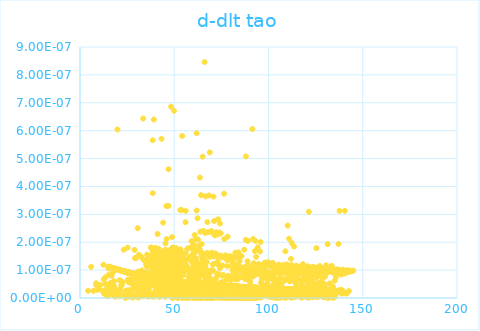
| Category | dlt tao |
|---|---|
| 4.34223444783905 | 0 |
| 5.92072630679717 | 0 |
| 7.15925973826904 | 0 |
| 8.57058924462024 | 0 |
| 8.62293453529598 | 0 |
| 9.17360343594597 | 0 |
| 10.0824104260836 | 0 |
| 10.8974767721707 | 0 |
| 12.1183744784521 | 0 |
| 12.4721690174564 | 0 |
| 12.5600557323604 | 0 |
| 12.8083956840816 | 0 |
| 13.4668110553315 | 0 |
| 13.4927758448734 | 0 |
| 14.1511483632955 | 0 |
| 14.3650617819764 | 0 |
| 15.078295659656 | 0 |
| 15.0849262510627 | 0 |
| 15.0882404540755 | 0 |
| 15.2136451910777 | 0 |
| 15.2661390010703 | 0 |
| 15.2661390010703 | 0 |
| 15.3053912070224 | 0 |
| 15.6222597597147 | 0 |
| 15.8320876702979 | 0 |
| 15.8825375806261 | 0 |
| 16.1355198242883 | 0 |
| 16.2158872714385 | 0 |
| 16.2282161681437 | 0 |
| 16.2466919709829 | 0 |
| 16.5817670952164 | 0 |
| 16.7198983250497 | 0 |
| 16.9780740957271 | 0 |
| 17.0661946549311 | 0 |
| 17.4829917348262 | 0 |
| 17.5685799084616 | 0 |
| 17.7018360629625 | 0 |
| 18.0043050407396 | 0 |
| 18.0209600188225 | 0 |
| 18.0625302767912 | 0 |
| 18.0818970243722 | 0 |
| 18.2141428565826 | 0 |
| 18.3127005108477 | 0 |
| 18.3454353995756 | 0 |
| 18.3753911522993 | 0 |
| 18.5379340812292 | 0 |
| 18.6267281077488 | 0 |
| 18.6776604530653 | 0 |
| 18.9487466603995 | 0 |
| 19.2003906210264 | 0 |
| 19.2861349160479 | 0 |
| 19.8508186229183 | 0 |
| 19.860891218674 | 0 |
| 19.8986180424672 | 0 |
| 19.9963746714248 | 0 |
| 20.0163683019673 | 0 |
| 20.1085802581883 | 0 |
| 20.1532875729991 | 0 |
| 20.197895930022 | 0 |
| 20.4537282665044 | 0 |
| 20.578022256767 | 0 |
| 20.824384744813 | 0 |
| 20.8531772159544 | 0 |
| 20.8843242648643 | 0 |
| 21.0060705511526 | 0 |
| 21.032237161082 | 0 |
| 21.0464961454395 | 0 |
| 21.0773575193856 | 0 |
| 21.1767561255259 | 0 |
| 21.2192129920033 | 0 |
| 21.2756903530767 | 0 |
| 21.4232350498238 | 0 |
| 21.5326496279487 | 0 |
| 21.5697705133828 | 0 |
| 21.8713282632766 | 0 |
| 21.912439389534 | 0 |
| 21.9352456106605 | 0 |
| 21.9398040100635 | 0 |
| 22.1665288216265 | 0 |
| 22.1980855030338 | 0 |
| 22.4623017520467 | 0 |
| 22.5422935833956 | 0 |
| 22.7388434182568 | 0 |
| 22.7739983314305 | 0 |
| 22.8266291861063 | 0 |
| 22.8791389698127 | 0 |
| 23.2412349069493 | 0 |
| 23.243386156066 | 0 |
| 23.260588986524 | 0 |
| 23.4297887314419 | 0 |
| 23.5064884659534 | 0 |
| 23.6443439325349 | 0 |
| 23.7477367342659 | 0 |
| 23.8108168696498 | 0 |
| 23.836002181574 | 0 |
| 24.0344544352477 | 0 |
| 24.0739485751715 | 0 |
| 24.0843310058635 | 0 |
| 24.0926337290052 | 0 |
| 24.1486024440339 | 0 |
| 24.1734358335757 | 0 |
| 24.204441741135 | 0 |
| 24.220961995759 | 0 |
| 24.2477834038495 | 0 |
| 24.3773460409455 | 0 |
| 24.4612959591269 | 0 |
| 24.6871424024734 | 0 |
| 24.7073875591897 | 0 |
| 24.9350155404002 | 0 |
| 25.045059393022 | 0 |
| 25.1407040474208 | 0 |
| 25.1744910574176 | 0 |
| 25.257771081392 | 0 |
| 25.3131388808263 | 0 |
| 25.3664148038307 | 0 |
| 25.4608523030947 | 0 |
| 25.6077136816234 | 0 |
| 25.6779087933578 | 0 |
| 25.7012645603286 | 0 |
| 25.7420861625471 | 0 |
| 25.8815571401722 | 0 |
| 25.9779714373544 | 0 |
| 26.1754656119046 | 0 |
| 26.1792857045413 | 0 |
| 26.2212699921266 | 0 |
| 26.3392292977604 | 0 |
| 26.3961171387005 | 0 |
| 26.4150525269211 | 0 |
| 26.5453385738438 | 0 |
| 26.6186964369032 | 0 |
| 26.6449807656151 | 0 |
| 26.7255495733951 | 0 |
| 26.815200912915 | 0 |
| 26.8412928153619 | 0 |
| 27.0250809434495 | 0 |
| 27.0306307732543 | 0 |
| 27.093449392796 | 0 |
| 27.1266474154106 | 0 |
| 27.2259986042753 | 0 |
| 27.2792045338569 | 0 |
| 27.3414520462978 | 0 |
| 27.4053826829694 | 0 |
| 27.5327986227336 | 0 |
| 27.5926620680209 | 0 |
| 27.6252601797703 | 0 |
| 27.6578198706984 | 0 |
| 27.7120010103926 | 0 |
| 27.7210209047214 | 0 |
| 27.7336438283901 | 0 |
| 27.8074630270365 | 0 |
| 28.1025799527374 | 0 |
| 28.1203662849544 | 0 |
| 28.2374750995906 | 0 |
| 28.2374750995906 | 0 |
| 28.290546124103 | 0 |
| 28.3205755591231 | 0 |
| 28.3276366822225 | 0 |
| 28.3752533028342 | 0 |
| 28.4227901515668 | 0 |
| 28.4333431027729 | 0 |
| 28.4368598829055 | 0 |
| 28.6016607909401 | 0 |
| 28.76725569115 | 0 |
| 28.8349614183893 | 0 |
| 28.8626921821233 | 0 |
| 28.9336309508503 | 0 |
| 29.0061200438804 | 0 |
| 29.0938997042335 | 0 |
| 29.1419800288175 | 0 |
| 29.2036812747982 | 0 |
| 29.3829031921626 | 0 |
| 29.4271133480673 | 0 |
| 29.4848266062394 | 0 |
| 29.6572925264597 | 0 |
| 29.7027776478901 | 0 |
| 29.9341777906125 | 0 |
| 29.9475374613673 | 0 |
| 30.0175781834578 | 0 |
| 30.0741583423377 | 0 |
| 30.1090517950998 | 0 |
| 30.2085252867465 | 0 |
| 30.3505354153761 | 0 |
| 30.3604183106887 | 0 |
| 30.416360729055 | 0 |
| 30.4196482556916 | 0 |
| 30.4311518020597 | 0 |
| 30.4410085246859 | 0 |
| 30.5590412153261 | 0 |
| 30.5590412153261 | 0 |
| 30.6064535678343 | 0 |
| 30.62278563423 | 0 |
| 30.798620098959 | 0 |
| 30.8213400098049 | 0 |
| 30.8715888803929 | 0 |
| 30.9912084307792 | 0 |
| 31.1039386573469 | 0 |
| 31.1745890109236 | 0 |
| 31.2514799649553 | 0 |
| 31.2626774285249 | 0 |
| 31.3712447951942 | 0 |
| 31.3871789111414 | 0 |
| 31.40628917908 | 0 |
| 31.5397368410074 | 0 |
| 31.5951736820673 | 0 |
| 31.6378728741362 | 0 |
| 31.7483070414786 | 0 |
| 31.7892277351936 | 0 |
| 31.8238118395644 | 0 |
| 31.8928675411917 | 0 |
| 31.8991379193859 | 0 |
| 31.9257732874241 | 0 |
| 31.9789774695815 | 0 |
| 32.0211648757506 | 0 |
| 32.2498837207206 | 0 |
| 32.3798548483467 | 0 |
| 32.3844870269702 | 0 |
| 32.3844870269702 | 0 |
| 32.5231456043231 | 0 |
| 32.5584858370287 | 0 |
| 32.564628049465 | 0 |
| 32.647434815005 | 0 |
| 32.6596846279936 | 0 |
| 32.6734601779487 | 0 |
| 32.7208649029942 | 0 |
| 33.0068932194474 | 0 |
| 33.0114374119032 | 0 |
| 33.0311216884925 | 0 |
| 33.0432292610755 | 0 |
| 33.0674311067552 | 0 |
| 33.0946370277723 | 0 |
| 33.0946370277723 | 0 |
| 33.2167879241808 | 0 |
| 33.275441394518 | 0 |
| 33.3054800295687 | 0 |
| 33.3069812501824 | 0 |
| 33.3234902133615 | 0 |
| 33.4373294388173 | 0 |
| 33.4866391266726 | 0 |
| 33.5045519295513 | 0 |
| 33.5045519295513 | 0 |
| 33.522455160683 | 0 |
| 33.5343853380377 | 0 |
| 33.6029016604221 | 0 |
| 33.6148032866474 | 0 |
| 33.6742483212321 | 0 |
| 33.8991887808543 | 0 |
| 33.9448817938729 | 0 |
| 33.9831575931372 | 0 |
| 34.0243295304992 | 0 |
| 34.0903945415714 | 0 |
| 34.1387609616987 | 0 |
| 34.1899839134212 | 0 |
| 34.2046049531346 | 0 |
| 34.4188175276258 | 0 |
| 34.4522132815876 | 0 |
| 34.4884763363069 | 0 |
| 34.504420006718 | 0 |
| 34.5869194927794 | 0 |
| 34.657683130873 | 0 |
| 34.6605683738741 | 0 |
| 34.7254229635868 | 0 |
| 34.8246320870731 | 0 |
| 34.8389867820521 | 0 |
| 34.8519009524588 | 0 |
| 34.9722032477223 | 0 |
| 34.9936422797056 | 0 |
| 35.0136401992138 | 0 |
| 35.0578807117601 | 0 |
| 35.1390808075567 | 0 |
| 35.177478590712 | 0 |
| 35.1817424241609 | 0 |
| 35.443687731386 | 0 |
| 35.4986619466143 | 0 |
| 35.52963551741 | 0 |
| 35.5718287412947 | 0 |
| 35.7848431601984 | 0 |
| 35.8323178150675 | 0 |
| 35.9187277057526 | 0 |
| 35.9896512903362 | 0 |
| 36.0063188898838 | 0 |
| 36.0285303613678 | 0 |
| 36.0576621538335 | 0 |
| 36.0659812011264 | 0 |
| 36.0729122750022 | 0 |
| 36.0826135417045 | 0 |
| 36.1283129968727 | 0 |
| 36.1324646267038 | 0 |
| 36.2926301058493 | 0 |
| 36.4424889380514 | 0 |
| 36.4589495186024 | 0 |
| 36.4589495186024 | 0 |
| 36.5534540091631 | 0 |
| 36.5575573582262 | 0 |
| 36.6545358721127 | 0 |
| 36.7008855478993 | 0 |
| 36.7974863271936 | 0 |
| 36.8029210797187 | 0 |
| 36.8219363966644 | 0 |
| 36.876211844494 | 0 |
| 36.8870573507836 | 0 |
| 37.0507084952501 | 0 |
| 37.0749915711386 | 0 |
| 37.0749915711386 | 0 |
| 37.1396688192019 | 0 |
| 37.1719652426395 | 0 |
| 37.1786901329243 | 0 |
| 37.190791871107 | 0 |
| 37.1948249088499 | 0 |
| 37.2163270621914 | 0 |
| 37.3316889518811 | 0 |
| 37.4333407539322 | 0 |
| 37.460045381713 | 0 |
| 37.5160632263035 | 0 |
| 37.5440408054328 | 0 |
| 37.5733283061269 | 0 |
| 37.5839726479253 | 0 |
| 37.6132290557458 | 0 |
| 37.7088185972459 | 0 |
| 37.8755197984133 | 0 |
| 37.8873989606043 | 0 |
| 37.8873989606043 | 0 |
| 38.0638279735499 | 0 |
| 38.1005905466044 | 0 |
| 38.1478046550519 | 0 |
| 38.1674599626436 | 0 |
| 38.1871051534415 | 0 |
| 38.2485947454282 | 0 |
| 38.3478161047015 | 0 |
| 38.4532833448589 | 0 |
| 38.494869788064 | 0 |
| 38.5221364931905 | 0 |
| 38.5312211070451 | 0 |
| 38.564945222313 | 0 |
| 38.6077064845867 | 0 |
| 38.8992930527021 | 0 |
| 38.901863708568 | 0 |
| 38.9378350707894 | 0 |
| 38.9763389763585 | 0 |
| 39.0019871288631 | 0 |
| 39.0481113499744 | 0 |
| 39.0493918006414 | 0 |
| 39.0609139678016 | 0 |
| 39.0647539349732 | 0 |
| 39.0685935247227 | 0 |
| 39.0724327371614 | 0 |
| 39.1146392032446 | 0 |
| 39.164460930798 | 0 |
| 39.1721201877049 | 0 |
| 39.1989158013331 | 0 |
| 39.2167693722979 | 0 |
| 39.2524521527 | 0 |
| 39.266461516159 | 0 |
| 39.373277740112 | 0 |
| 39.4050123715245 | 0 |
| 39.4202359201464 | 0 |
| 39.4202359201464 | 0 |
| 39.4240408887775 | 0 |
| 39.4278454902116 | 0 |
| 39.5190460411179 | 0 |
| 39.519046041118 | 0 |
| 39.6504098339475 | 0 |
| 39.678142597657 | 0 |
| 39.6844427956347 | 0 |
| 39.7561944858911 | 0 |
| 39.8541716762499 | 0 |
| 39.9155984547395 | 0 |
| 39.9494055024602 | 0 |
| 39.9681748394895 | 0 |
| 39.9906864157143 | 0 |
| 39.9906864157144 | 0 |
| 40.0693773348177 | 0 |
| 40.0880905007959 | 0 |
| 40.1690801487911 | 0 |
| 40.1852584911432 | 0 |
| 40.1852584911432 | 0 |
| 40.2287832279327 | 0 |
| 40.230026099917 | 0 |
| 40.2933617361471 | 0 |
| 40.2970842617676 | 0 |
| 40.32561220862 | 0 |
| 40.3677470265558 | 0 |
| 40.4086005696807 | 0 |
| 40.4630077972461 | 0 |
| 40.5074684471889 | 0 |
| 40.6885118921791 | 0 |
| 40.7302712978934 | 0 |
| 40.7376361611716 | 0 |
| 40.7449996932139 | 0 |
| 40.7449996932139 | 0 |
| 40.8406047947383 | 0 |
| 40.8699767555598 | 0 |
| 40.8699767555598 | 0 |
| 40.965290185717 | 0 |
| 41.0372391858907 | 0 |
| 41.0421125187289 | 0 |
| 41.0810783694878 | 0 |
| 41.1078459664332 | 0 |
| 41.1175753176181 | 0 |
| 41.1175753176181 | 0 |
| 41.2050360999721 | 0 |
| 41.3757779383059 | 0 |
| 41.3939005168636 | 0 |
| 41.413222526145 | 0 |
| 41.4699288641782 | 0 |
| 41.5036745361179 | 0 |
| 41.6083525268665 | 0 |
| 41.6119574161082 | 0 |
| 41.6323792257901 | 0 |
| 41.6899868073858 | 0 |
| 41.7235544986282 | 0 |
| 41.7307440623816 | 0 |
| 41.8264868235428 | 0 |
| 41.8527776855969 | 0 |
| 41.8527776855969 | 0 |
| 41.9982737740493 | 0 |
| 42.063701691601 | 0 |
| 42.0637016916011 | 0 |
| 42.0850923724779 | 0 |
| 42.1302148107507 | 0 |
| 42.1563162527278 | 0 |
| 42.1634320234964 | 0 |
| 42.1764744851914 | 0 |
| 42.1847721340296 | 0 |
| 42.2096552935463 | 0 |
| 42.2380752402379 | 0 |
| 42.2439936559033 | 0 |
| 42.2475443073322 | 0 |
| 42.2617439299421 | 0 |
| 42.3728096779055 | 0 |
| 42.3869673366708 | 0 |
| 42.3869673366708 | 0 |
| 42.4294119685861 | 0 |
| 42.4859388504008 | 0 |
| 42.4859388504009 | 0 |
| 42.565890099938 | 0 |
| 42.6151968199139 | 0 |
| 42.693734903379 | 0 |
| 42.6995901619676 | 0 |
| 42.7919969153112 | 0 |
| 42.797838730478 | 0 |
| 42.890033807401 | 0 |
| 42.8970278690727 | 0 |
| 42.918003215434 | 0 |
| 42.918003215434 | 0 |
| 42.980867836748 | 0 |
| 43.0157529284331 | 0 |
| 43.02272655237 | 0 |
| 43.139946685178 | 0 |
| 43.1411056881949 | 0 |
| 43.1434236008224 | 0 |
| 43.1608039776833 | 0 |
| 43.2001736107623 | 0 |
| 43.2001736107623 | 0 |
| 43.2371946361001 | 0 |
| 43.2753393978603 | 0 |
| 43.2868917803069 | 0 |
| 43.3584478504478 | 0 |
| 43.3619072458765 | 0 |
| 43.4080061739767 | 0 |
| 43.4114616201759 | 0 |
| 43.427583400415 | 0 |
| 43.475912871382 | 0 |
| 43.6217262381947 | 0 |
| 43.6217262381947 | 0 |
| 43.7179025114426 | 0 |
| 43.7453426092424 | 0 |
| 43.7647689357547 | 0 |
| 43.8195732521438 | 0 |
| 43.8412477012231 | 0 |
| 43.8446690031981 | 0 |
| 43.8914000688062 | 0 |
| 43.9358054438518 | 0 |
| 44.0051701507902 | 0 |
| 44.1197801445111 | 0 |
| 44.2114804095045 | 0 |
| 44.2295715556911 | 0 |
| 44.3176601367897 | 0 |
| 44.3176601367897 | 0 |
| 44.3379634173696 | 0 |
| 44.4798268881524 | 0 |
| 44.5371193500433 | 0 |
| 44.6044280313065 | 0 |
| 44.6649191200432 | 0 |
| 44.6649191200432 | 0 |
| 44.7610880117988 | 0 |
| 44.7990513292413 | 0 |
| 44.848132625562 | 0 |
| 44.9183147502219 | 0 |
| 44.9327831321408 | 0 |
| 44.9327831321408 | 0 |
| 44.976160351902 | 0 |
| 44.9950552838865 | 0 |
| 45.0117206958365 | 0 |
| 45.0161637636972 | 0 |
| 45.0561316581883 | 0 |
| 45.0627895275026 | 0 |
| 45.1492524855063 | 0 |
| 45.1558966249149 | 0 |
| 45.1592183280446 | 0 |
| 45.2012721059928 | 0 |
| 45.2244955748541 | 0 |
| 45.2256011568669 | 0 |
| 45.2775330600067 | 0 |
| 45.2819500463485 | 0 |
| 45.3404344928453 | 0 |
| 45.3415372478702 | 0 |
| 45.3448453520353 | 0 |
| 45.3503583227299 | 0 |
| 45.3580753559937 | 0 |
| 45.4571776510597 | 0 |
| 45.5022526914877 | 0 |
| 45.6010416547692 | 0 |
| 45.6185817403391 | 0 |
| 45.650355967944 | 0 |
| 45.7236809541839 | 0 |
| 45.7269614122784 | 0 |
| 45.7269614122784 | 0 |
| 45.7488251215264 | 0 |
| 45.7630309310911 | 0 |
| 45.8121708719419 | 0 |
| 45.8176276120883 | 0 |
| 45.8350848150192 | 0 |
| 45.8547162241792 | 0 |
| 45.9527474695475 | 0 |
| 46.0625118724544 | 0 |
| 46.075535808062 | 0 |
| 46.1254268272934 | 0 |
| 46.1536022429452 | 0 |
| 46.2672130131046 | 0 |
| 46.3007019385236 | 0 |
| 46.3125792846825 | 0 |
| 46.3427987933401 | 0 |
| 46.3643720975492 | 0 |
| 46.39671324566 | 0 |
| 46.4484122441231 | 0 |
| 46.4548705734931 | 0 |
| 46.514030141453 | 0 |
| 46.5451930923055 | 0 |
| 46.6331963305112 | 0 |
| 46.636412812308 | 0 |
| 46.6717794818239 | 0 |
| 46.7937495826099 | 0 |
| 46.808706455103 | 0 |
| 46.8930165376466 | 0 |
| 46.8930165376466 | 0 |
| 46.9335168083535 | 0 |
| 46.9441689669761 | 0 |
| 46.9824967408077 | 0 |
| 47.067557829146 | 0 |
| 47.1927430861992 | 0 |
| 47.3672355114799 | 0 |
| 47.3672355114799 | 0 |
| 47.3735685799582 | 0 |
| 47.3735685799582 | 0 |
| 47.3830665955677 | 0 |
| 47.3851770071612 | 0 |
| 47.3946726964118 | 0 |
| 47.436852762383 | 0 |
| 47.4494994704897 | 0 |
| 47.483207558041 | 0 |
| 47.5000526315498 | 0 |
| 47.5053154920584 | 0 |
| 47.5158394643302 | 0 |
| 47.6440447485307 | 0 |
| 47.7321170701656 | 0 |
| 47.7928341909119 | 0 |
| 47.9234285084029 | 0 |
| 47.9922389558979 | 0 |
| 48.0016145561792 | 0 |
| 48.0245249846368 | 0 |
| 48.0422210144369 | 0 |
| 48.0495057206627 | 0 |
| 48.0827931800972 | 0 |
| 48.143068036842 | 0 |
| 48.1492990603186 | 0 |
| 48.1773286930689 | 0 |
| 48.2074164418713 | 0 |
| 48.214676188895 | 0 |
| 48.2395584556907 | 0 |
| 48.2488859975026 | 0 |
| 48.2758221058948 | 0 |
| 48.3079186055454 | 0 |
| 48.3079186055454 | 0 |
| 48.3203373332596 | 0 |
| 48.3327528700777 | 0 |
| 48.3947827766589 | 0 |
| 48.4040804065112 | 0 |
| 48.4185398375457 | 0 |
| 48.4319625867051 | 0 |
| 48.4412530804066 | 0 |
| 48.5340602051796 | 0 |
| 48.6071496798568 | 0 |
| 48.6729390935045 | 0 |
| 48.7058004759187 | 0 |
| 48.7222228556949 | 0 |
| 48.7683811500853 | 0 |
| 48.7806826520499 | 0 |
| 48.7991290905893 | 0 |
| 48.7991290905893 | 0 |
| 48.8226893974513 | 0 |
| 48.8421436875983 | 0 |
| 48.86261351995 | 0 |
| 48.8759143136985 | 0 |
| 48.8973925685205 | 0 |
| 48.8973925685205 | 0 |
| 48.9147728196708 | 0 |
| 48.9484933373848 | 0 |
| 48.9944384598905 | 0 |
| 49.0923110069184 | 0 |
| 49.1360865352543 | 0 |
| 49.1360865352543 | 0 |
| 49.147278663218 | 0 |
| 49.1808397650955 | 0 |
| 49.186939323361 | 0 |
| 49.2153939331994 | 0 |
| 49.2661648598711 | 0 |
| 49.2722538554916 | 0 |
| 49.2844295898817 | 0 |
| 49.4191764399206 | 0 |
| 49.4242349460262 | 0 |
| 49.5182289667149 | 0 |
| 49.5222677186738 | 0 |
| 49.5404380279384 | 0 |
| 49.5848263080552 | 0 |
| 49.5949090129219 | 0 |
| 49.6855612829321 | 0 |
| 49.6966296643948 | 0 |
| 49.8142048014419 | 0 |
| 49.8302618897393 | 0 |
| 49.8633633041334 | 0 |
| 49.8633633041334 | 0 |
| 49.8804069750839 | 0 |
| 49.9405146148896 | 0 |
| 49.9475224610791 | 0 |
| 49.9925494448923 | 0 |
| 50.0125484253702 | 0 |
| 50.0695016951437 | 0 |
| 50.1154167896467 | 0 |
| 50.2290254733257 | 0 |
| 50.3542947522851 | 0 |
| 50.466374944115 | 0 |
| 50.4941085672378 | 0 |
| 50.5495301659669 | 0 |
| 50.5673313513775 | 0 |
| 50.5940213859306 | 0 |
| 50.6305737672407 | 0 |
| 50.8434361545323 | 0 |
| 50.8601513957637 | 0 |
| 50.9348112787316 | 0 |
| 50.9877926566742 | 0 |
| 50.9897538727145 | 0 |
| 51.020143080944 | 0 |
| 51.0230830115155 | 0 |
| 51.0436577842929 | 0 |
| 51.0612867052917 | 0 |
| 51.0965263007183 | 0 |
| 51.0965263007183 | 0 |
| 51.1112022946047 | 0 |
| 51.1376084696968 | 0 |
| 51.143474657086 | 0 |
| 51.1923334103848 | 0 |
| 51.2020995663264 | 0 |
| 51.2050290498892 | 0 |
| 51.2957600587027 | 0 |
| 51.2986841936516 | 0 |
| 51.301608161928 | 0 |
| 51.3094045960387 | 0 |
| 51.3103790670075 | 0 |
| 51.3308386839724 | 0 |
| 51.409678077187 | 0 |
| 51.4611989755388 | 0 |
| 51.5000485436665 | 0 |
| 51.546629375741 | 0 |
| 51.5689344470099 | 0 |
| 51.627076229436 | 0 |
| 51.6280447044046 | 0 |
| 51.6541866647806 | 0 |
| 51.6677365480626 | 0 |
| 51.6832177790818 | 0 |
| 51.6909566558794 | 0 |
| 51.696760053218 | 0 |
| 51.7325332841917 | 0 |
| 51.7373656074601 | 0 |
| 51.747028900218 | 0 |
| 51.7499275361812 | 0 |
| 51.7499275361812 | 0 |
| 51.8126914954242 | 0 |
| 51.8483847385818 | 0 |
| 51.8512777084615 | 0 |
| 51.8647761009339 | 0 |
| 51.9081400167642 | 0 |
| 51.9341409864455 | 0 |
| 51.9370291795748 | 0 |
| 52.0322496150224 | 0 |
| 52.1157845570802 | 0 |
| 52.1934382849032 | 0 |
| 52.2135518807139 | 0 |
| 52.2145094777304 | 0 |
| 52.2346149598138 | 0 |
| 52.3292938993065 | 0 |
| 52.3350265118878 | 0 |
| 52.3579506856409 | 0 |
| 52.4028148098936 | 0 |
| 52.4123554135854 | 0 |
| 52.4180789422886 | 0 |
| 52.420940472296 | 0 |
| 52.4457338589136 | 0 |
| 52.4552666564569 | 0 |
| 52.4752798944417 | 0 |
| 52.4981428242943 | 0 |
| 52.5029046815507 | 0 |
| 52.5971006805508 | 0 |
| 52.6939749876587 | 0 |
| 52.779304656276 | 0 |
| 52.8275969546221 | 0 |
| 52.8285434211469 | 0 |
| 52.8332754994426 | 0 |
| 52.8701711743021 | 0 |
| 52.8739538903608 | 0 |
| 52.9240493537673 | 0 |
| 52.9863661709312 | 0 |
| 53.0071221629697 | 0 |
| 53.0071221629697 | 0 |
| 53.0184401882968 | 0 |
| 53.0806461904902 | 0 |
| 53.0806461904902 | 0 |
| 53.1004237271229 | 0 |
| 53.1004237271229 | 0 |
| 53.1963814558848 | 0 |
| 53.2245713932954 | 0 |
| 53.3390569845399 | 0 |
| 53.3456183767702 | 0 |
| 53.3784132398107 | 0 |
| 53.4205484808983 | 0 |
| 53.4242922274128 | 0 |
| 53.4242922274128 | 0 |
| 53.600886186704 | 0 |
| 53.600886186704 | 0 |
| 53.6064828169131 | 0 |
| 53.6903622636317 | 0 |
| 53.6978118734833 | 0 |
| 53.7592317653443 | 0 |
| 53.8131489507908 | 0 |
| 53.8205815650481 | 0 |
| 53.8242974872873 | 0 |
| 53.8317285622522 | 0 |
| 53.8317285622522 | 0 |
| 54.0162475557123 | 0 |
| 54.0162475557124 | 0 |
| 54.021801154719 | 0 |
| 54.021801154719 | 0 |
| 54.0319812703551 | 0 |
| 54.0467852883037 | 0 |
| 54.0606603733251 | 0 |
| 54.0994916796822 | 0 |
| 54.1096571787329 | 0 |
| 54.1161251384465 | 0 |
| 54.1327534862213 | 0 |
| 54.1382951338514 | 0 |
| 54.1438362142913 | 0 |
| 54.149376727715 | 0 |
| 54.184453489908 | 0 |
| 54.189989850525 | 0 |
| 54.1964482231078 | 0 |
| 54.2148964768909 | 0 |
| 54.2794159880152 | 0 |
| 54.2877057905379 | 0 |
| 54.2904687767568 | 0 |
| 54.3971966189435 | 0 |
| 54.455991405905 | 0 |
| 54.490870795024 | 0 |
| 54.6310808972329 | 0 |
| 54.6338265180099 | 0 |
| 54.6484674990983 | 0 |
| 54.6594456612945 | 0 |
| 54.6896242444579 | 0 |
| 54.706078272894 | 0 |
| 54.7161310766761 | 0 |
| 54.718872429903 | 0 |
| 54.7444517736729 | 0 |
| 54.8046987036696 | 0 |
| 54.9350070537904 | 0 |
| 54.9786776850808 | 0 |
| 55.0068632081489 | 0 |
| 55.0858874849085 | 0 |
| 55.0913332566929 | 0 |
| 55.0940559407274 | 0 |
| 55.1366937710269 | 0 |
| 55.1502946501649 | 0 |
| 55.1566405793536 | 0 |
| 55.2490271407561 | 0 |
| 55.2490271407561 | 0 |
| 55.2598859933677 | 0 |
| 55.289736841479 | 0 |
| 55.3249943515587 | 0 |
| 55.3249943515587 | 0 |
| 55.3575198143848 | 0 |
| 55.3728724196244 | 0 |
| 55.379192843522 | 0 |
| 55.3837069904137 | 0 |
| 55.5189607251433 | 0 |
| 55.5540727579896 | 0 |
| 55.571170583316 | 0 |
| 55.5900620614872 | 0 |
| 55.6107453645426 | 0 |
| 55.6404079783749 | 0 |
| 55.735581095024 | 0 |
| 55.735581095024 | 0 |
| 55.7911731369757 | 0 |
| 55.8672981269007 | 0 |
| 55.8690880541288 | 0 |
| 55.9388505423556 | 0 |
| 55.9388505423556 | 0 |
| 55.9683392642662 | 0 |
| 55.9710192867702 | 0 |
| 55.979951768468 | 0 |
| 55.9853105733995 | 0 |
| 56.0460078863785 | 0 |
| 56.0460078863785 | 0 |
| 56.0888135014461 | 0 |
| 56.1084218277435 | 0 |
| 56.1511798629379 | 0 |
| 56.3005772616942 | 0 |
| 56.3005772616942 | 0 |
| 56.3556119654467 | 0 |
| 56.3910897216928 | 0 |
| 56.3928630236132 | 0 |
| 56.4123656656943 | 0 |
| 56.472603977504 | 0 |
| 56.5372001429148 | 0 |
| 56.6220363462848 | 0 |
| 56.6264514162772 | 0 |
| 56.7772401583592 | 0 |
| 56.8230147035513 | 0 |
| 56.859959549757 | 0 |
| 56.986445756864 | 0 |
| 57.0460778669314 | 0 |
| 57.0600998947601 | 0 |
| 57.0811264780225 | 0 |
| 57.1284079946221 | 0 |
| 57.1336590811406 | 0 |
| 57.1572830005066 | 0 |
| 57.1887663794211 | 0 |
| 57.2114936004996 | 0 |
| 57.2464409374067 | 0 |
| 57.2464409374067 | 0 |
| 57.2778753097564 | 0 |
| 57.2979493524856 | 0 |
| 57.3110373313902 | 0 |
| 57.3197609904298 | 0 |
| 57.3197609904298 | 0 |
| 57.3616160860205 | 0 |
| 57.5600121612218 | 0 |
| 57.5600121612218 | 0 |
| 57.6164473045675 | 0 |
| 57.6381384154624 | 0 |
| 57.6407408002361 | 0 |
| 57.666758188752 | 0 |
| 57.729152081076 | 0 |
| 57.7655173957613 | 0 |
| 57.8770679976103 | 0 |
| 57.9047061990647 | 0 |
| 57.9306050374066 | 0 |
| 57.9357834157785 | 0 |
| 58.0004741359931 | 0 |
| 58.0039222811699 | 0 |
| 58.057342343583 | 0 |
| 58.0728421897878 | 0 |
| 58.0728421897878 | 0 |
| 58.0935022184065 | 0 |
| 58.1124341255811 | 0 |
| 58.1244784922841 | 0 |
| 58.1631756354482 | 0 |
| 58.1820848715479 | 0 |
| 58.1820848715479 | 0 |
| 58.2027061226538 | 0 |
| 58.2533690012861 | 0 |
| 58.2671004941897 | 0 |
| 58.2902650534375 | 0 |
| 58.3108480473402 | 0 |
| 58.330566601054 | 0 |
| 58.3391378064503 | 0 |
| 58.3665572053038 | 0 |
| 58.4230690737828 | 0 |
| 58.7388712863977 | 0 |
| 58.7533403305718 | 0 |
| 58.8120310820839 | 0 |
| 58.8358309196021 | 0 |
| 58.8935904831757 | 0 |
| 58.9394180493836 | 0 |
| 58.9707978579229 | 0 |
| 59.0038558062098 | 0 |
| 59.0292723993783 | 0 |
| 59.0919199214241 | 0 |
| 59.1029187096543 | 0 |
| 59.1029187096543 | 0 |
| 59.1206816604816 | 0 |
| 59.1891459644418 | 0 |
| 59.2693428342174 | 0 |
| 59.2895859321011 | 0 |
| 59.3283658969299 | 0 |
| 59.3991161550406 | 0 |
| 59.4773486295413 | 0 |
| 59.47987054458 | 0 |
| 59.47987054458 | 0 |
| 59.5328060820251 | 0 |
| 59.5454028452239 | 0 |
| 59.5554783374292 | 0 |
| 59.5747849345678 | 0 |
| 59.6678724272954 | 0 |
| 59.7013818935542 | 0 |
| 59.8093220158865 | 0 |
| 59.8394100906752 | 0 |
| 59.9320865647109 | 0 |
| 59.9320865647109 | 0 |
| 59.9462676069161 | 0 |
| 59.9921244831353 | 0 |
| 60.0121237751173 | 0 |
| 60.0362806975915 | 0 |
| 60.0595954032326 | 0 |
| 60.0762432247557 | 0 |
| 60.1037020490419 | 0 |
| 60.1111886423817 | 0 |
| 60.1170109037367 | 0 |
| 60.1294852796862 | 0 |
| 60.1810186022138 | 0 |
| 60.1810186022138 | 0 |
| 60.1818494232273 | 0 |
| 60.2059382453259 | 0 |
| 60.2142425012555 | 0 |
| 60.24661816235 | 0 |
| 60.2789764345746 | 0 |
| 60.2806353649329 | 0 |
| 60.3088301992337 | 0 |
| 60.3154623624821 | 0 |
| 60.3461266362639 | 0 |
| 60.3800877773459 | 0 |
| 60.3983029562918 | 0 |
| 60.4396806742061 | 0 |
| 60.4727624637737 | 0 |
| 60.5983085572527 | 0 |
| 60.6164581611298 | 0 |
| 60.6164581611298 | 0 |
| 60.6313037959766 | 0 |
| 60.6774669873422 | 0 |
| 60.6782910108714 | 0 |
| 60.7178309889278 | 0 |
| 60.7301819526338 | 0 |
| 60.7639284444316 | 0 |
| 60.7770927241506 | 0 |
| 60.793544065139 | 0 |
| 60.8157463162296 | 0 |
| 60.8510887330704 | 0 |
| 60.8970853161299 | 0 |
| 61.0422394739905 | 0 |
| 61.1290029364131 | 0 |
| 61.1314567141991 | 0 |
| 61.1649818114908 | 0 |
| 61.249122442693 | 0 |
| 61.2825831700982 | 0 |
| 61.338853918214 | 0 |
| 61.3657477751229 | 0 |
| 61.4536817448719 | 0 |
| 61.4862179679316 | 0 |
| 61.4862179679316 | 0 |
| 61.5593615951303 | 0 |
| 61.6048293561471 | 0 |
| 61.6510746053952 | 0 |
| 61.6737788691434 | 0 |
| 61.7078196017328 | 0 |
| 61.7782728797107 | 0 |
| 61.7782728797107 | 0 |
| 61.7879842687881 | 0 |
| 61.7952668090364 | 0 |
| 61.8413696484805 | 0 |
| 61.8413696484805 | 0 |
| 61.8559213010364 | 0 |
| 61.8850143411149 | 0 |
| 61.9092480975177 | 0 |
| 61.9262060843388 | 0 |
| 62.2419071044582 | 0 |
| 62.2692139022166 | 0 |
| 62.2860738849384 | 0 |
| 62.2949034833509 | 0 |
| 62.3093492182353 | 0 |
| 62.3141637190134 | 0 |
| 62.3358243709025 | 0 |
| 62.3582793219954 | 0 |
| 62.3582793219954 | 0 |
| 62.3622882838659 | 0 |
| 62.4400112107613 | 0 |
| 62.4776359988116 | 0 |
| 62.4904392687394 | 0 |
| 62.5544163109209 | 0 |
| 62.5815867488193 | 0 |
| 62.6358922663356 | 0 |
| 62.671803867449 | 0 |
| 62.6773882672212 | 0 |
| 62.7061001817208 | 0 |
| 62.7180596000865 | 0 |
| 62.8367328876987 | 0 |
| 62.9988491958385 | 0 |
| 63.0012301467202 | 0 |
| 63.0591389094396 | 0 |
| 63.079751109211 | 0 |
| 63.09718694205 | 0 |
| 63.1257079168226 | 0 |
| 63.2183122204318 | 0 |
| 63.2538931608166 | 0 |
| 63.26021656618 | 0 |
| 63.2791829909331 | 0 |
| 63.3107810724208 | 0 |
| 63.3170987964547 | 0 |
| 63.3321008652011 | 0 |
| 63.5071255844571 | 0 |
| 63.5307405906778 | 0 |
| 63.5401841357105 | 0 |
| 63.570865968618 | 0 |
| 63.6015330003924 | 0 |
| 63.6416137444676 | 0 |
| 63.6840246843744 | 0 |
| 63.6981553893047 | 0 |
| 63.7122829601954 | 0 |
| 63.7122829601954 | 0 |
| 63.7781702465664 | 0 |
| 63.7781702465664 | 0 |
| 63.7875771604472 | 0 |
| 63.8298911169368 | 0 |
| 63.9378995588689 | 0 |
| 63.972298692481 | 0 |
| 63.995742045858 | 0 |
| 64.0129283816949 | 0 |
| 64.0223008021424 | 0 |
| 64.0449451557264 | 0 |
| 64.1346630146288 | 0 |
| 64.1346630146288 | 0 |
| 64.1931071066045 | 0 |
| 64.1954437635569 | 0 |
| 64.2141339581871 | 0 |
| 64.3238291770632 | 0 |
| 64.3533604406172 | 0 |
| 64.3883141571512 | 0 |
| 64.4216966557075 | 0 |
| 64.4232489090701 | 0 |
| 64.4356655897959 | 0 |
| 64.44187303299 | 0 |
| 64.5163157658588 | 0 |
| 64.5442096550883 | 0 |
| 64.5589265710018 | 0 |
| 64.5767372975749 | 0 |
| 64.5984132932071 | 0 |
| 64.6092485639634 | 0 |
| 64.6517981188459 | 0 |
| 64.8086028240079 | 0 |
| 64.8232597143958 | 0 |
| 64.8325149905508 | 0 |
| 64.9065096889364 | 0 |
| 64.9157530958395 | 0 |
| 65.0119604380609 | 0 |
| 65.0288782003811 | 0 |
| 65.0627005280291 | 0 |
| 65.0673113014515 | 0 |
| 65.0719217481703 | 0 |
| 65.3686086741947 | 0 |
| 65.4381769305961 | 0 |
| 65.4748424969469 | 0 |
| 65.5313283857424 | 0 |
| 65.5572650436243 | 0 |
| 65.5847162073604 | 0 |
| 65.72636457313 | 0 |
| 65.72636457313 | 0 |
| 65.7309287930728 | 0 |
| 65.7507034182905 | 0 |
| 65.7993541001734 | 0 |
| 65.8221467288936 | 0 |
| 65.8669492234156 | 0 |
| 65.9996590900286 | 0 |
| 65.9996590900286 | 0 |
| 66.0587238750492 | 0 |
| 66.0632651327498 | 0 |
| 66.0632651327498 | 0 |
| 66.0768870332131 | 0 |
| 66.1018532266683 | 0 |
| 66.1222731006731 | 0 |
| 66.1328587012538 | 0 |
| 66.2378668134776 | 0 |
| 66.2446601621595 | 0 |
| 66.2801252261943 | 0 |
| 66.3193410703092 | 0 |
| 66.3283875878195 | 0 |
| 66.3894193377228 | 0 |
| 66.4406125799575 | 0 |
| 66.4834941921677 | 0 |
| 66.5331120570803 | 0 |
| 66.5428809114844 | 0 |
| 66.5556534037493 | 0 |
| 66.6007132093944 | 0 |
| 66.6014639478743 | 0 |
| 66.6239821685855 | 0 |
| 66.6689957926471 | 0 |
| 66.7042352478461 | 0 |
| 66.7514419319912 | 0 |
| 66.7634256161261 | 0 |
| 66.7806483945761 | 0 |
| 66.7963696618312 | 0 |
| 66.8008607728972 | 0 |
| 66.812087229782 | 0 |
| 66.8524868647383 | 0 |
| 66.9533793023175 | 0 |
| 66.9586066163268 | 0 |
| 66.9698066295551 | 0 |
| 67.0168262453542 | 0 |
| 67.1062962768771 | 0 |
| 67.1331140347295 | 0 |
| 67.1420509070136 | 0 |
| 67.2729886358559 | 0 |
| 67.3287085870508 | 0 |
| 67.4340789215661 | 0 |
| 67.4377861439712 | 0 |
| 67.4474239685994 | 0 |
| 67.4955924486925 | 0 |
| 67.4955924486925 | 0 |
| 67.5089253358399 | 0 |
| 67.5296601501889 | 0 |
| 67.5585301793933 | 0 |
| 67.6044007443303 | 0 |
| 67.7447783965672 | 0 |
| 67.8089595849988 | 0 |
| 67.8133836347959 | 0 |
| 67.8458178519502 | 0 |
| 67.8841292203119 | 0 |
| 67.9459711829921 | 0 |
| 67.9459711829922 | 0 |
| 67.9724576574954 | 0 |
| 68.0209894076821 | 0 |
| 68.0268696913212 | 0 |
| 68.3421904828928 | 0 |
| 68.4036183253488 | 0 |
| 68.4036183253488 | 0 |
| 68.4101966084004 | 0 |
| 68.4211590080145 | 0 |
| 68.4737540960038 | 0 |
| 68.5700736473281 | 0 |
| 68.5766359629867 | 0 |
| 68.595590237274 | 0 |
| 68.665529925866 | 0 |
| 68.6786356882546 | 0 |
| 68.7528544861957 | 0 |
| 68.7746683016356 | 0 |
| 68.8400682742253 | 0 |
| 68.9692322706292 | 0 |
| 68.9844547706221 | 0 |
| 68.9989492673621 | 0 |
| 69.0098181420586 | 0 |
| 69.0540006082197 | 0 |
| 69.0583448976299 | 0 |
| 69.0793384450083 | 0 |
| 69.0800622466425 | 0 |
| 69.1191362793257 | 0 |
| 69.1646947510072 | 0 |
| 69.2138353221377 | 0 |
| 69.2362260669947 | 0 |
| 69.2744902543498 | 0 |
| 69.2946967667801 | 0 |
| 69.3076835567313 | 0 |
| 69.3163400649515 | 0 |
| 69.4222946898185 | 0 |
| 69.6035559436442 | 0 |
| 69.6423362617884 | 0 |
| 69.648797548845 | 0 |
| 69.7062048888046 | 0 |
| 69.7793307505883 | 0 |
| 69.8036890142634 | 0 |
| 69.9046135816514 | 0 |
| 69.9081897920408 | 0 |
| 69.9146265097655 | 0 |
| 69.9303582144408 | 0 |
| 69.9582375421222 | 0 |
| 69.9639550054169 | 0 |
| 69.9668135618595 | 0 |
| 69.9668135618595 | 0 |
| 69.9903921977867 | 0 |
| 70.0396673321626 | 0 |
| 70.095327947018 | 0 |
| 70.2236071417583 | 0 |
| 70.2385577870161 | 0 |
| 70.2599103329915 | 0 |
| 70.274141759256 | 0 |
| 70.2826792317994 | 0 |
| 70.2876589452231 | 0 |
| 70.3004623028896 | 0 |
| 70.4468239170511 | 0 |
| 70.4666942604803 | 0 |
| 70.5092547117043 | 0 |
| 70.6070463905693 | 0 |
| 70.6424447481824 | 0 |
| 70.6516454160836 | 0 |
| 70.6728731551223 | 0 |
| 70.7252076702501 | 0 |
| 70.7937497241105 | 0 |
| 70.797281021237 | 0 |
| 70.8149348654647 | 0 |
| 70.8396428562426 | 0 |
| 71.0088374781618 | 0 |
| 71.0721816184082 | 0 |
| 71.0918771731342 | 0 |
| 71.1354693524967 | 0 |
| 71.3467238210697 | 0 |
| 71.3719482710119 | 0 |
| 71.4720574770308 | 0 |
| 71.4937409847883 | 0 |
| 71.5776152159319 | 0 |
| 71.6111374019433 | 0 |
| 71.6230060804488 | 0 |
| 71.6816224704771 | 0 |
| 71.7220677337178 | 0 |
| 71.7610967028794 | 0 |
| 71.875969558678 | 0 |
| 72.0559157876715 | 0 |
| 72.0579974742568 | 0 |
| 72.0781173450028 | 0 |
| 72.1162603023756 | 0 |
| 72.1266594263175 | 0 |
| 72.1266594263176 | 0 |
| 72.1391363962725 | 0 |
| 72.1599265520691 | 0 |
| 72.1599265520691 | 0 |
| 72.180710719693 | 0 |
| 72.1820961180818 | 0 |
| 72.2554842209226 | 0 |
| 72.2969916386567 | 0 |
| 72.3052902628846 | 0 |
| 72.4565732007801 | 0 |
| 72.4869298563541 | 0 |
| 72.5000344827504 | 0 |
| 72.5248578075132 | 0 |
| 72.5538076188976 | 0 |
| 72.5806792473039 | 0 |
| 72.6158040649555 | 0 |
| 72.61786970161 | 0 |
| 72.632327513305 | 0 |
| 72.7492611646332 | 0 |
| 72.7973557212074 | 0 |
| 72.8378678985046 | 0 |
| 72.8790436270949 | 0 |
| 72.8941355665873 | 0 |
| 72.9078528006415 | 0 |
| 72.9435055368194 | 0 |
| 72.9859918066474 | 0 |
| 72.9901020687052 | 0 |
| 73.0065408028623 | 0 |
| 73.0524126911631 | 0 |
| 73.0722587580266 | 0 |
| 73.0811535212739 | 0 |
| 73.0873108001656 | 0 |
| 73.1317646443733 | 0 |
| 73.1714083505299 | 0 |
| 73.2240056265703 | 0 |
| 73.253361697604 | 0 |
| 73.3181764639574 | 0 |
| 73.3897472403333 | 0 |
| 73.4088209958449 | 0 |
| 73.4203990727373 | 0 |
| 73.4210800792252 | 0 |
| 73.4551223537202 | 0 |
| 73.5863778154626 | 0 |
| 73.6067592004974 | 0 |
| 73.6434314789853 | 0 |
| 73.8021341154848 | 0 |
| 73.88880158725 | 0 |
| 74.041576158264 | 0 |
| 74.1124483470895 | 0 |
| 74.2075130967209 | 0 |
| 74.253989791795 | 0 |
| 74.2661093635583 | 0 |
| 74.2782269578374 | 0 |
| 74.2802463646965 | 0 |
| 74.3118765743404 | 0 |
| 74.4496809932722 | 0 |
| 74.4939930464195 | 0 |
| 74.5262034454997 | 0 |
| 74.5275452433528 | 0 |
| 74.6428496240598 | 0 |
| 74.7626577911727 | 0 |
| 74.913650291519 | 0 |
| 74.93166887238 | 0 |
| 75.0110325218898 | 0 |
| 75.0116990875424 | 0 |
| 75.035691507442 | 0 |
| 75.0390231812755 | 0 |
| 75.0576778217925 | 0 |
| 75.0769938130184 | 0 |
| 75.0789917353716 | 0 |
| 75.1136139458088 | 0 |
| 75.1555387180479 | 0 |
| 75.2014295076896 | 0 |
| 75.2386536296338 | 0 |
| 75.2672239424306 | 0 |
| 75.2871502980422 | 0 |
| 75.2944553071473 | 0 |
| 75.295119363741 | 0 |
| 75.3502156599435 | 0 |
| 75.3581780565321 | 0 |
| 75.4821502078472 | 0 |
| 75.5953371577904 | 0 |
| 75.6707010671898 | 0 |
| 75.6759869443406 | 0 |
| 75.711656962452 | 0 |
| 75.7215623188006 | 0 |
| 75.7321266042358 | 0 |
| 75.8462589716856 | 0 |
| 75.86076060784 | 0 |
| 75.9970723120306 | 0 |
| 76.1272290314051 | 0 |
| 76.2276524628694 | 0 |
| 76.2492950787087 | 0 |
| 76.2820752208538 | 0 |
| 76.3371141712863 | 0 |
| 76.3469383800032 | 0 |
| 76.3692019075753 | 0 |
| 76.4163267895023 | 0 |
| 76.4908818095334 | 0 |
| 76.5457706212433 | 0 |
| 76.6162841698813 | 0 |
| 76.6808646273632 | 0 |
| 76.7486481965644 | 0 |
| 76.7688413355315 | 0 |
| 76.8313412612327 | 0 |
| 76.8469583002477 | 0 |
| 76.9269458642419 | 0 |
| 76.9464424128887 | 0 |
| 76.9639850839339 | 0 |
| 76.9906163113402 | 0 |
| 77.150210628358 | 0 |
| 77.1916770124863 | 0 |
| 77.2279418345459 | 0 |
| 77.2395947684865 | 0 |
| 77.2829541360836 | 0 |
| 77.3055948816126 | 0 |
| 77.3191761466714 | 0 |
| 77.4316149902609 | 0 |
| 77.4341978714831 | 0 |
| 77.4380720317855 | 0 |
| 77.5380874151536 | 0 |
| 77.6579358468921 | 0 |
| 77.8495664727814 | 0 |
| 77.9208252009692 | 0 |
| 78.0573827385982 | 0 |
| 78.0759566063715 | 0 |
| 78.0778777887822 | 0 |
| 78.1111707760164 | 0 |
| 78.1514875098357 | 0 |
| 78.2237495905176 | 0 |
| 78.2473961228104 | 0 |
| 78.2780620608354 | 0 |
| 78.2857266684036 | 0 |
| 78.316377597537 | 0 |
| 78.4178232291614 | 0 |
| 78.4573450991047 | 0 |
| 78.4656294182364 | 0 |
| 78.5210481336056 | 0 |
| 78.5630638404588 | 0 |
| 78.6775380906139 | 0 |
| 78.6959655890949 | 0 |
| 78.7423329601048 | 0 |
| 78.7537618149127 | 0 |
| 78.7804226949818 | 0 |
| 78.8159565062812 | 0 |
| 78.8425963550161 | 0 |
| 78.9610980166816 | 0 |
| 78.9762939115277 | 0 |
| 79.0901700592431 | 0 |
| 79.2133511473918 | 0 |
| 79.2796001503539 | 0 |
| 79.280861498851 | 0 |
| 79.288429168448 | 0 |
| 79.3186926266438 | 0 |
| 79.4440369064916 | 0 |
| 79.4698370452589 | 0 |
| 79.470466212298 | 0 |
| 79.4893389078058 | 0 |
| 79.6495762700594 | 0 |
| 79.6847225006149 | 0 |
| 79.7436831354058 | 0 |
| 79.8257790441158 | 0 |
| 79.8840096640123 | 0 |
| 79.8921460470302 | 0 |
| 79.8959010212664 | 0 |
| 80.0871712573244 | 0 |
| 80.1115160260995 | 0 |
| 80.122125533463 | 0 |
| 80.3427345812924 | 0 |
| 80.4776677097442 | 0 |
| 80.5199043715279 | 0 |
| 80.5223881911112 | 0 |
| 80.5608776019726 | 0 |
| 80.7196072834847 | 0 |
| 80.7270400795174 | 0 |
| 80.7957610274203 | 0 |
| 80.8068994579052 | 0 |
| 80.8143242253501 | 0 |
| 80.9737920564426 | 0 |
| 81.019472967923 | 0 |
| 81.0571094969467 | 0 |
| 81.0645113474448 | 0 |
| 81.0749961455442 | 0 |
| 81.077462959814 | 0 |
| 81.1089082653687 | 0 |
| 81.147735643085 | 0 |
| 81.1828491739481 | 0 |
| 81.2210256029804 | 0 |
| 81.2696437792119 | 0 |
| 81.2770262743415 | 0 |
| 81.3925979435477 | 0 |
| 81.450322282972 | 0 |
| 81.4662813684287 | 0 |
| 81.6085473464637 | 0 |
| 81.6214126317353 | 0 |
| 81.6722413063337 | 0 |
| 81.7603510266437 | 0 |
| 81.7878658481807 | 0 |
| 81.9057690275844 | 0 |
| 81.9277425540336 | 0 |
| 81.9423882981208 | 0 |
| 81.9423882981208 | 0 |
| 81.9728918606633 | 0 |
| 82.2432672016379 | 0 |
| 82.2602881103635 | 0 |
| 82.2724437463724 | 0 |
| 82.2839899372898 | 0 |
| 82.3732662943506 | 0 |
| 82.3860121622597 | 0 |
| 82.3932946300851 | 0 |
| 82.4145314856549 | 0 |
| 82.4369759270681 | 0 |
| 82.5733310458044 | 0 |
| 82.6253895603525 | 0 |
| 82.7584134695682 | 0 |
| 82.8254489876149 | 0 |
| 82.8326928211319 | 0 |
| 82.9050963451584 | 0 |
| 82.9388630257252 | 0 |
| 82.9828596759596 | 0 |
| 82.9985240832631 | 0 |
| 83.0153901394194 | 0 |
| 83.0370700350151 | 0 |
| 83.2175161849956 | 0 |
| 83.28238108988 | 0 |
| 83.3741866527045 | 0 |
| 83.419152477114 | 0 |
| 83.4706834762961 | 0 |
| 83.522781323421 | 0 |
| 83.6543782476447 | 0 |
| 83.6985961650493 | 0 |
| 83.7021803778134 | 0 |
| 83.7153211783841 | 0 |
| 83.9330387868806 | 0 |
| 83.9640101472053 | 0 |
| 84.0009226139809 | 0 |
| 84.0675621152416 | 0 |
| 84.0741042176484 | 0 |
| 84.0764830377675 | 0 |
| 84.095511176281 | 0 |
| 84.106807096691 | 0 |
| 84.1442511405265 | 0 |
| 84.146033774623 | 0 |
| 84.2618240960876 | 0 |
| 84.2689444576114 | 0 |
| 84.4361000994243 | 0 |
| 84.5160044015333 | 0 |
| 84.5266526014133 | 0 |
| 84.5568152191176 | 0 |
| 84.650191966705 | 0 |
| 84.6997933881778 | 0 |
| 84.7617543471111 | 0 |
| 84.83427962799 | 0 |
| 84.8543163309917 | 0 |
| 84.8967313858431 | 0 |
| 84.9232300374874 | 0 |
| 85.0220853660977 | 0 |
| 85.1155391218313 | 0 |
| 85.1554754551931 | 0 |
| 85.2012617277467 | 0 |
| 85.2176918251134 | 0 |
| 85.2845531148519 | 0 |
| 85.3882603172122 | 0 |
| 85.5701758792163 | 0 |
| 85.705046525861 | 0 |
| 85.7353777620417 | 0 |
| 85.7633663052005 | 0 |
| 85.7680301744187 | 0 |
| 85.8140722725591 | 0 |
| 85.9328516924698 | 0 |
| 85.9468149497118 | 0 |
| 85.9677555831255 | 0 |
| 85.9799685973425 | 0 |
| 85.9846207178935 | 0 |
| 86.1002613236453 | 0 |
| 86.355978368611 | 0 |
| 86.3866598497708 | 0 |
| 86.4080725395492 | 0 |
| 86.4098084710295 | 0 |
| 86.4717005730777 | 0 |
| 86.521991424146 | 0 |
| 86.5485701788308 | 0 |
| 86.6230627489008 | 0 |
| 86.7597544948117 | 0 |
| 86.7954779928079 | 0 |
| 86.832338445996 | 0 |
| 86.895655817768 | 0 |
| 87.0031895967039 | 0 |
| 87.0732737411429 | 0 |
| 87.0755706268986 | 0 |
| 87.1048506112031 | 0 |
| 87.1410064206284 | 0 |
| 87.1582182011542 | 0 |
| 87.1628074352817 | 0 |
| 87.2304705937094 | 0 |
| 87.2545414290855 | 0 |
| 87.2614175910523 | 0 |
| 87.3364471455074 | 0 |
| 87.3971109362318 | 0 |
| 87.482884040251 | 0 |
| 87.5103136778746 | 0 |
| 87.5205975756564 | 0 |
| 87.6285056360087 | 0 |
| 87.6296468097413 | 0 |
| 87.6815545026433 | 0 |
| 87.704931446299 | 0 |
| 87.7271622703026 | 0 |
| 87.7374207507834 | 0 |
| 87.8746550491096 | 0 |
| 87.8814826911791 | 0 |
| 87.9133380096559 | 0 |
| 87.9355161467766 | 0 |
| 88.0094029067349 | 0 |
| 88.024172816335 | 0 |
| 88.1620950295534 | 0 |
| 88.1779734400831 | 0 |
| 88.2459914103751 | 0 |
| 88.2663865806231 | 0 |
| 88.3054641570951 | 0 |
| 88.3099937719396 | 0 |
| 88.3428265339071 | 0 |
| 88.5186703469952 | 0 |
| 88.5768310564337 | 0 |
| 88.6084363929305 | 0 |
| 88.6106934856059 | 0 |
| 88.6665382204584 | 0 |
| 88.6862728949639 | 0 |
| 88.7054395175403 | 0 |
| 88.8828161120022 | 0 |
| 88.8856287596595 | 0 |
| 88.9030651890024 | 0 |
| 88.9300567862182 | 0 |
| 89.0615236788592 | 0 |
| 89.0766804500482 | 0 |
| 89.1114751308719 | 0 |
| 89.1182080160951 | 0 |
| 89.136720828175 | 0 |
| 89.2012051488095 | 0 |
| 89.2281065584158 | 0 |
| 89.308202310874 | 0 |
| 89.3305938634688 | 0 |
| 89.5385671093747 | 0 |
| 89.5687166370045 | 0 |
| 89.6033202509818 | 0 |
| 89.6585467203211 | 0 |
| 89.8006403095212 | 0 |
| 89.924718514989 | 0 |
| 89.9547386189299 | 0 |
| 90.0114159426459 | 0 |
| 90.0697229928015 | 0 |
| 90.0724985775348 | 0 |
| 90.103024366555 | 0 |
| 90.210614674771 | 0 |
| 90.2477423540335 | 0 |
| 90.2543904749237 | 0 |
| 90.2859623640353 | 0 |
| 90.326933967671 | 0 |
| 90.3623538870032 | 0 |
| 90.4066092716678 | 0 |
| 90.4950551135254 | 0 |
| 90.5049998618861 | 0 |
| 90.6104574538723 | 0 |
| 90.6236999906758 | 0 |
| 90.6490761122252 | 0 |
| 90.6749965536255 | 0 |
| 90.6865756327804 | 0 |
| 90.7119341652464 | 0 |
| 90.714690100336 | 0 |
| 90.8540312809509 | 0 |
| 90.9920600931752 | 0 |
| 91.0667612249387 | 0 |
| 91.1254903964857 | 0 |
| 91.2642043738946 | 0 |
| 91.300355968638 | 0 |
| 91.416929504332 | 0 |
| 91.4284146204013 | 0 |
| 91.4448194267997 | 0 |
| 91.4590345455275 | 0 |
| 91.470514374852 | 0 |
| 91.603793589567 | 0 |
| 91.632717955979 | 0 |
| 91.7706652476705 | 0 |
| 91.7750238354641 | 0 |
| 91.8147863908641 | 0 |
| 91.8229546464282 | 0 |
| 91.8425554958049 | 0 |
| 91.85507607095 | 0 |
| 92.0443099816605 | 0 |
| 92.0595187908345 | 0 |
| 92.1843533361275 | 0 |
| 92.2347819426056 | 0 |
| 92.2629665683908 | 0 |
| 92.3896909833559 | 0 |
| 92.4232384197827 | 0 |
| 92.4302710155066 | 0 |
| 92.5270500988765 | 0 |
| 92.6377622786734 | 0 |
| 92.6814706400368 | 0 |
| 92.7116767187392 | 0 |
| 92.7639746884533 | 0 |
| 93.062640194656 | 0 |
| 93.0717733794731 | 0 |
| 93.0766082321439 | 0 |
| 93.0787569749403 | 0 |
| 93.1013157801758 | 0 |
| 93.2092001896809 | 0 |
| 93.2413802986635 | 0 |
| 93.2478149878055 | 0 |
| 93.4374389631908 | 0 |
| 93.4738198641737 | 0 |
| 93.4904005767437 | 0 |
| 93.5924943571866 | 0 |
| 93.6934095868007 | 0 |
| 93.7307580253142 | 0 |
| 93.8150041304695 | 0 |
| 93.9385703531835 | 0 |
| 93.9619869947417 | 0 |
| 93.9976329489206 | 0 |
| 94.0912057527164 | 0 |
| 94.1730056863431 | 0 |
| 94.1825620802492 | 0 |
| 94.2605696991059 | 0 |
| 94.3189005449067 | 0 |
| 94.4349246836148 | 0 |
| 94.5687844904438 | 0 |
| 94.5825300993793 | 0 |
| 94.6079013613557 | 0 |
| 94.7378224364483 | 0 |
| 94.7668454682333 | 0 |
| 94.7858375497099 | 0 |
| 94.8817948818423 | 0 |
| 94.8823218518603 | 0 |
| 95.1659340310387 | 0 |
| 95.3160794409842 | 0 |
| 95.3679977770321 | 0 |
| 95.5120673004202 | 0 |
| 95.735338303053 | 0 |
| 95.7807652924114 | 0 |
| 95.82251823032 | 0 |
| 95.8397360180004 | 0 |
| 95.8903279794162 | 0 |
| 96.0559992920796 | 0 |
| 96.071093467286 | 0 |
| 96.0841037841328 | 0 |
| 96.0997138393242 | 0 |
| 96.2354144792862 | 0 |
| 96.2416489883668 | 0 |
| 96.2738541868975 | 0 |
| 96.4673779056941 | 0 |
| 96.476707033356 | 0 |
| 96.5756439274417 | 0 |
| 96.6320598973239 | 0 |
| 96.7670140078736 | 0 |
| 96.7918126702874 | 0 |
| 96.8042096192103 | 0 |
| 96.8754612892243 | 0 |
| 96.9337660467187 | 0 |
| 96.9621317834958 | 0 |
| 97.1146487405479 | 0 |
| 97.1872162375279 | 0 |
| 97.2077928974833 | 0 |
| 97.2232225345365 | 0 |
| 97.2720669051501 | 0 |
| 97.3167765598512 | 0 |
| 97.365060468322 | 0 |
| 97.3753305514287 | 0 |
| 97.7325687782737 | 0 |
| 97.7525191491248 | 0 |
| 97.9221884967856 | 0 |
| 97.9717050989723 | 0 |
| 97.9788497585066 | 0 |
| 98.1139898281586 | 0 |
| 98.2881223749849 | 0 |
| 98.3094858088476 | 0 |
| 98.417757544053 | 0 |
| 98.481241868693 | 0 |
| 98.5558471121831 | 0 |
| 98.712993065756 | 0 |
| 98.9921966621612 | 0 |
| 99.0704547279359 | 0 |
| 99.0855943111813 | 0 |
| 99.0982088637328 | 0 |
| 99.2298090293436 | 0 |
| 99.2358554152681 | 0 |
| 99.2640670131947 | 0 |
| 99.3431175270839 | 0 |
| 99.3838769620103 | 0 |
| 99.4638376496705 | 0 |
| 99.5598061468583 | 0 |
| 99.6546787662275 | 0 |
| 99.6953108225257 | 0 |
| 99.754473583895 | 0 |
| 99.7604881704175 | 0 |
| 99.7695093703482 | 0 |
| 99.7815363682079 | 0 |
| 99.8761983657768 | 0 |
| 99.9072319704635 | 0 |
| 99.919242391043 | 0 |
| 100.063254994029 | 0 |
| 100.156153081076 | 0 |
| 100.173125138432 | 0 |
| 100.188098095532 | 0 |
| 100.474648543799 | 0 |
| 100.612399832227 | 0 |
| 100.646683999027 | 0 |
| 100.682446334999 | 0 |
| 100.813466362386 | 0 |
| 100.865529295196 | 0 |
| 100.866520709302 | 0 |
| 100.874451671372 | 0 |
| 100.945306973628 | 0 |
| 101.142745661763 | 0 |
| 101.242555281858 | 0 |
| 101.304269406575 | 0 |
| 101.425613135933 | 0 |
| 101.545827092993 | 0 |
| 101.908071319204 | 0 |
| 102.021835898008 | 0 |
| 102.069853531785 | 0 |
| 102.070343391212 | 0 |
| 102.096792310043 | 0 |
| 102.149180123974 | 0 |
| 102.1697362236 | 0 |
| 102.224532280661 | 0 |
| 102.230401544746 | 0 |
| 102.413646551619 | 0 |
| 102.442935334751 | 0 |
| 102.451720336947 | 0 |
| 102.527337817774 | 0 |
| 102.544892608067 | 0 |
| 102.558544256439 | 0 |
| 102.637005996863 | 0 |
| 102.652106651544 | 0 |
| 102.748503638739 | 0 |
| 102.760181977262 | 0 |
| 102.882238505973 | 0 |
| 102.949283630339 | 0 |
| 103.140462477148 | 0 |
| 103.155004725898 | 0 |
| 103.240762298619 | 0 |
| 103.339513256063 | 0 |
| 103.465718960436 | 0 |
| 103.480215500355 | 0 |
| 103.635201548509 | 0 |
| 103.648227191786 | 0 |
| 103.814040476228 | 0 |
| 103.822709461851 | 0 |
| 104.011802214941 | 0 |
| 104.025261355115 | 0 |
| 104.066589258993 | 0 |
| 104.179436550598 | 0 |
| 104.406201923066 | 0 |
| 104.631520107471 | 0 |
| 104.679295947193 | 0 |
| 104.812475402502 | 0 |
| 104.975497141 | 0 |
| 105.069286663611 | 0 |
| 105.080707077941 | 0 |
| 105.095456609694 | 0 |
| 105.187713160806 | 0 |
| 105.219556167093 | 0 |
| 105.225258374594 | 0 |
| 105.257565048789 | 0 |
| 105.373407461276 | 0 |
| 105.431755178409 | 0 |
| 105.440291160448 | 0 |
| 105.530824880695 | 0 |
| 105.545037780087 | 0 |
| 105.620334216476 | 0 |
| 105.697469222304 | 0 |
| 105.728685795294 | 0 |
| 105.753746978535 | 0 |
| 105.858655763239 | 0 |
| 106.048833091176 | 0 |
| 106.087016170689 | 0 |
| 106.109636697145 | 0 |
| 106.123772077702 | 0 |
| 106.270198080177 | 0 |
| 106.355324267288 | 0 |
| 106.434275494316 | 0 |
| 106.548369297704 | 0 |
| 106.590595269939 | 0 |
| 106.670309833618 | 0 |
| 106.76448379494 | 0 |
| 106.84172873929 | 0 |
| 107.119816093942 | 0 |
| 107.238775636427 | 0 |
| 107.340369852167 | 0 |
| 107.354808928152 | 0 |
| 107.560006507995 | 0 |
| 107.568373604884 | 0 |
| 107.581852558877 | 0 |
| 107.746716887337 | 0 |
| 107.850614277342 | 0 |
| 108.002106460939 | 0 |
| 108.068751265109 | 0 |
| 108.094195033776 | 0 |
| 108.11593314586 | 0 |
| 108.181583460402 | 0 |
| 108.198220872619 | 0 |
| 108.214855726929 | 0 |
| 108.220400110146 | 0 |
| 108.421192577835 | 0 |
| 108.429493220249 | 0 |
| 108.453008257033 | 0 |
| 108.517533145571 | 0 |
| 108.568664908435 | 0 |
| 108.727894305003 | 0 |
| 108.7315731515 | 0 |
| 108.77341127316 | 0 |
| 108.836368002612 | 0 |
| 108.947946286288 | 0 |
| 109.080497798644 | 0 |
| 109.094248244351 | 0 |
| 109.0956231936 | 0 |
| 109.232572980773 | 0 |
| 109.236692553372 | 0 |
| 109.237150274071 | 0 |
| 109.531981630937 | 0 |
| 109.54384966761 | 0 |
| 109.548413954744 | 0 |
| 109.628714304237 | 0 |
| 109.673857413697 | 0 |
| 109.717614811843 | 0 |
| 110.047058116062 | 0 |
| 110.06341353965 | 0 |
| 110.097479535183 | 0 |
| 110.16557992404 | 0 |
| 110.278080324242 | 0 |
| 110.337006484679 | 0 |
| 110.431675709463 | 0 |
| 110.53078756618 | 0 |
| 110.673641848455 | 0 |
| 110.691259817566 | 0 |
| 110.708423347097 | 0 |
| 110.759897977562 | 0 |
| 110.916883295556 | 0 |
| 111.032225052009 | 0 |
| 111.068244786708 | 0 |
| 111.093001579758 | 0 |
| 111.210408685518 | 0 |
| 111.215803733103 | 0 |
| 111.361371220006 | 0 |
| 111.386960637231 | 0 |
| 111.393244858025 | 0 |
| 111.411197821404 | 0 |
| 111.419275711162 | 0 |
| 111.50495504685 | 0 |
| 111.512129385103 | 0 |
| 111.589672461209 | 0 |
| 111.632678907209 | 0 |
| 111.692233391584 | 0 |
| 111.702976683703 | 0 |
| 111.815271765533 | 0 |
| 111.89439217405 | 0 |
| 111.923880383053 | 0 |
| 111.960059842785 | 0 |
| 112.039524276034 | 0 |
| 112.066297342243 | 0 |
| 112.125175585147 | 0 |
| 112.204968695687 | 0 |
| 112.230365766133 | 0 |
| 112.42399654878 | 0 |
| 112.426664986559 | 0 |
| 112.492466414423 | 0 |
| 112.508466348093 | 0 |
| 112.754844685273 | 0 |
| 112.79075760008 | 0 |
| 112.963511808017 | 0 |
| 113.117438973838 | 0 |
| 113.219057583077 | 0 |
| 113.2270064958 | 0 |
| 113.289253682774 | 0 |
| 113.321026292564 | 0 |
| 113.529974015676 | 0 |
| 113.604379316996 | 0 |
| 114.062943149824 | 0 |
| 114.067764946982 | 0 |
| 114.091870876062 | 0 |
| 114.206195103418 | 0 |
| 114.211448638042 | 0 |
| 114.263970699429 | 0 |
| 114.401726385575 | 0 |
| 114.409593129248 | 0 |
| 114.493034722642 | 0 |
| 114.538879861818 | 0 |
| 114.558522162256 | 0 |
| 114.575542765461 | 0 |
| 114.675433288913 | 0 |
| 114.701155181628 | 0 |
| 114.795274292978 | 0 |
| 114.808340289371 | 0 |
| 114.857106876327 | 0 |
| 114.901066139527 | 0 |
| 115.018933224057 | 0 |
| 115.039797461574 | 0 |
| 115.174888756187 | 0 |
| 115.234782075552 | 0 |
| 115.434202037351 | 0 |
| 115.454991230349 | 0 |
| 115.470580668844 | 0 |
| 115.477075647074 | 0 |
| 115.836328498446 | 0 |
| 115.908821924822 | 0 |
| 115.93815161542 | 0 |
| 115.952382467977 | 0 |
| 116.154014136404 | 0 |
| 116.163053506698 | 0 |
| 116.311456873345 | 0 |
| 116.538641660181 | 0 |
| 116.725125829874 | 0 |
| 116.754678707108 | 0 |
| 116.769666437821 | 0 |
| 116.866398079174 | 0 |
| 117.028009467819 | 0 |
| 117.06730969831 | 0 |
| 117.068591005444 | 0 |
| 117.090798101303 | 0 |
| 117.207316324537 | 0 |
| 117.238880069711 | 0 |
| 117.392738276267 | 0 |
| 117.400404598962 | 0 |
| 117.406366948305 | 0 |
| 117.449797786118 | 0 |
| 117.454906240651 | 0 |
| 117.481721982613 | 0 |
| 117.562132508729 | 0 |
| 117.659487505258 | 0 |
| 117.669685985814 | 0 |
| 117.683707453496 | 0 |
| 117.776292181406 | 0 |
| 117.87940871925 | 0 |
| 117.918001170305 | 0 |
| 118.014638922466 | 0 |
| 118.052340086929 | 0 |
| 118.094686586654 | 0 |
| 118.14632876226 | 0 |
| 118.202178490923 | 0 |
| 118.212753119111 | 0 |
| 118.271953564655 | 0 |
| 118.419402970966 | 0 |
| 118.434602207294 | 0 |
| 118.601243669702 | 0 |
| 118.663199855726 | 0 |
| 118.71038286519 | 0 |
| 118.715437075386 | 0 |
| 119.0254384575 | 0 |
| 119.103547386297 | 0 |
| 119.109844261505 | 0 |
| 119.461102455988 | 0 |
| 119.476169171932 | 0 |
| 119.494999895393 | 0 |
| 119.582837397346 | 0 |
| 119.701524635236 | 0 |
| 119.803401454216 | 0 |
| 119.918117897172 | 0 |
| 120.023143601557 | 0 |
| 120.066877197668 | 0 |
| 120.08977891561 | 0 |
| 120.11350881562 | 0 |
| 120.20339013522 | 0 |
| 120.220443353034 | 0 |
| 120.38419746794 | 0 |
| 120.391673300108 | 0 |
| 120.470971607271 | 0 |
| 120.518691496382 | 0 |
| 120.644332647663 | 0 |
| 120.654278830052 | 0 |
| 120.75825023575 | 0 |
| 120.771085115602 | 0 |
| 120.82199716939 | 0 |
| 120.858822598932 | 0 |
| 120.878678847843 | 0 |
| 120.953524132205 | 0 |
| 120.960964777899 | 0 |
| 120.978324504847 | 0 |
| 120.990722784848 | 0 |
| 121.09936003134 | 0 |
| 121.119176846608 | 0 |
| 121.241721366863 | 0 |
| 121.266462799902 | 0 |
| 121.385563392028 | 0 |
| 121.400391267903 | 0 |
| 121.401214985683 | 0 |
| 121.521417865329 | 0 |
| 121.600390624373 | 0 |
| 121.905516692232 | 0 |
| 122.059227426688 | 0 |
| 122.140718026381 | 0 |
| 122.181238330605 | 0 |
| 122.416726798261 | 0 |
| 122.589375559222 | 0 |
| 122.636678852617 | 0 |
| 122.644017383646 | 0 |
| 122.65747021686 | 0 |
| 122.774814192488 | 0 |
| 122.996971507432 | 0 |
| 123.038835332589 | 0 |
| 123.066465781707 | 0 |
| 123.088809401992 | 0 |
| 123.199655031985 | 0 |
| 123.376071423919 | 0 |
| 123.383365977752 | 0 |
| 123.460742748454 | 0 |
| 123.462362685962 | 0 |
| 123.568017706848 | 0 |
| 123.629911429233 | 0 |
| 123.639617437131 | 0 |
| 123.720875360628 | 0 |
| 123.730574232887 | 0 |
| 123.741080486636 | 0 |
| 123.839230456265 | 0 |
| 123.946984634561 | 0 |
| 123.955859078948 | 0 |
| 123.967959570205 | 0 |
| 124.093331811182 | 0 |
| 124.151339098698 | 0 |
| 124.212942159825 | 0 |
| 124.341284374901 | 0 |
| 124.35334736146 | 0 |
| 124.367821400875 | 0 |
| 124.490782791338 | 0 |
| 124.657751463758 | 0 |
| 124.716698962088 | 0 |
| 124.786437564344 | 0 |
| 124.914190546951 | 0 |
| 125.011019514281 | 0 |
| 125.308239952527 | 0 |
| 125.318214956965 | 0 |
| 125.360101308191 | 0 |
| 125.366881591591 | 0 |
| 125.385226402475 | 0 |
| 125.5748979693 | 0 |
| 125.638190849757 | 0 |
| 125.783762863098 | 0 |
| 125.96767442483 | 0 |
| 126.066073945372 | 0 |
| 126.087886016064 | 0 |
| 126.167567147821 | 0 |
| 126.196097404001 | 0 |
| 126.207586935176 | 0 |
| 126.21154859996 | 0 |
| 126.368330684551 | 0 |
| 126.375452521445 | 0 |
| 126.450998414406 | 0 |
| 126.491719096548 | 0 |
| 126.555343624835 | 0 |
| 126.616171952875 | 0 |
| 126.625649060528 | 0 |
| 126.641837478773 | 0 |
| 126.724721345127 | 0 |
| 126.820562212916 | 0 |
| 126.90805726982 | 0 |
| 126.912785013961 | 0 |
| 126.934451588211 | 0 |
| 126.946268160982 | 0 |
| 127.068701889962 | 0 |
| 127.169394903019 | 0 |
| 127.18551411226 | 0 |
| 127.322641348662 | 0 |
| 127.336777876621 | 0 |
| 127.482371330314 | 0 |
| 127.536484975869 | 0 |
| 127.619963171911 | 0 |
| 127.65913598329 | 0 |
| 127.780104085104 | 0 |
| 127.9650538233 | 0 |
| 127.974431039954 | 0 |
| 128.102127226678 | 0 |
| 128.190307745945 | 0 |
| 128.194988201567 | 0 |
| 128.306098841793 | 0 |
| 128.507801319609 | 0 |
| 128.515971770049 | 0 |
| 128.580150101017 | 0 |
| 128.885821563118 | 0 |
| 128.899786656146 | 0 |
| 129.065700323517 | 0 |
| 129.068412092192 | 0 |
| 129.087005542773 | 0 |
| 129.192704902405 | 0 |
| 129.272792961241 | 0 |
| 129.35012562808 | 0 |
| 129.360948512293 | 0 |
| 129.367905602588 | 0 |
| 129.404617382843 | 0 |
| 129.441705025853 | 0 |
| 129.603067093337 | 0 |
| 129.612325802757 | 0 |
| 129.684829490577 | 0 |
| 129.709116873102 | 0 |
| 129.8189315932 | 0 |
| 129.914029265511 | 0 |
| 129.925574849604 | 0 |
| 130.005211434004 | 0 |
| 130.045203679336 | 0 |
| 130.159344651085 | 0 |
| 130.170100253476 | 0 |
| 130.286434443498 | 0 |
| 130.293342116932 | 0 |
| 130.307156365259 | 0 |
| 130.364316436669 | 0 |
| 130.415317351912 | 0 |
| 130.449434648066 | 0 |
| 130.568966450685 | 0 |
| 130.583900232762 | 0 |
| 130.65509940297 | 0 |
| 130.740410738226 | 0 |
| 130.848977833226 | 0 |
| 130.921178577035 | 0 |
| 131.004026655672 | 0 |
| 131.077286361902 | 0 |
| 131.383237134727 | 0 |
| 131.385520511204 | 0 |
| 131.459708656303 | 0 |
| 131.616317377444 | 0 |
| 131.834953635218 | 0 |
| 132.063450659143 | 0 |
| 132.064207868749 | 0 |
| 132.065343675016 | 0 |
| 132.071022559833 | 0 |
| 132.086165059025 | 0 |
| 132.189466297432 | 0 |
| 132.260557234574 | 0 |
| 132.353900584758 | 0 |
| 132.360700360794 | 0 |
| 132.466807163153 | 0 |
| 132.590553962188 | 0 |
| 132.599604071807 | 0 |
| 132.69421615127 | 0 |
| 132.785748482283 | 0 |
| 132.874207429433 | 0 |
| 132.894525846628 | 0 |
| 132.905812513976 | 0 |
| 133.022761210253 | 0 |
| 133.182037077077 | 0 |
| 133.19104699641 | 0 |
| 133.278861789858 | 0 |
| 133.349371952027 | 0 |
| 133.417971053378 | 0 |
| 133.467430483995 | 0 |
| 133.549447771228 | 0 |
| 133.606717645484 | 0 |
| 133.702486887866 | 0 |
| 133.825838312338 | 0 |
| 133.879255301185 | 0 |
| 133.964752827003 | 0 |
| 134.187387633861 | 0 |
| 134.199310728483 | 0 |
| 134.264124024253 | 0 |
| 134.358308265622 | 0 |
| 134.405933648779 | 0 |
| 134.772975777787 | 0 |
| 134.800797475386 | 0 |
| 134.803764784223 | 0 |
| 134.997240712542 | 0 |
| 135.122740499148 | 0 |
| 135.258105117586 | 0 |
| 135.404782042585 | 0 |
| 135.590762959724 | 0 |
| 135.698028725549 | 0 |
| 135.958651802671 | 0 |
| 136.042107452068 | 0 |
| 136.056440494377 | 0 |
| 136.370286353003 | 0 |
| 136.374686067466 | 0 |
| 136.655241392345 | 0 |
| 136.857060468213 | 0 |
| 136.87788353127 | 0 |
| 137.021002039833 | 0 |
| 137.111104583108 | 0 |
| 137.150118483361 | 0 |
| 137.547646290295 | 0 |
| 137.671184348795 | 0 |
| 137.675542490306 | 0 |
| 137.990778677417 | 0 |
| 138.058158034938 | 0 |
| 138.319033397432 | 0 |
| 138.554159085897 | 0 |
| 138.744567461216 | 0 |
| 138.775556204974 | 0 |
| 138.891162425836 | 0 |
| 139.152272708713 | 0 |
| 139.491773951011 | 0 |
| 139.580997990414 | 0 |
| 139.850116195876 | 0 |
| 139.874068361509 | 0 |
| 140.30201352796 | 0 |
| 140.487205823164 | 0 |
| 140.866443839546 | 0 |
| 141.0583389949 | 0 |
| 141.506024606728 | 0 |
| 141.539234843205 | 0 |
| 141.93891291679 | 0 |
| 142.296011890706 | 0 |
| 142.646608792498 | 0 |
| 143.066260872366 | 0 |
| 143.808049148857 | 0 |
| 144.247201012706 | 0 |
| 145.022256912517 | 0 |